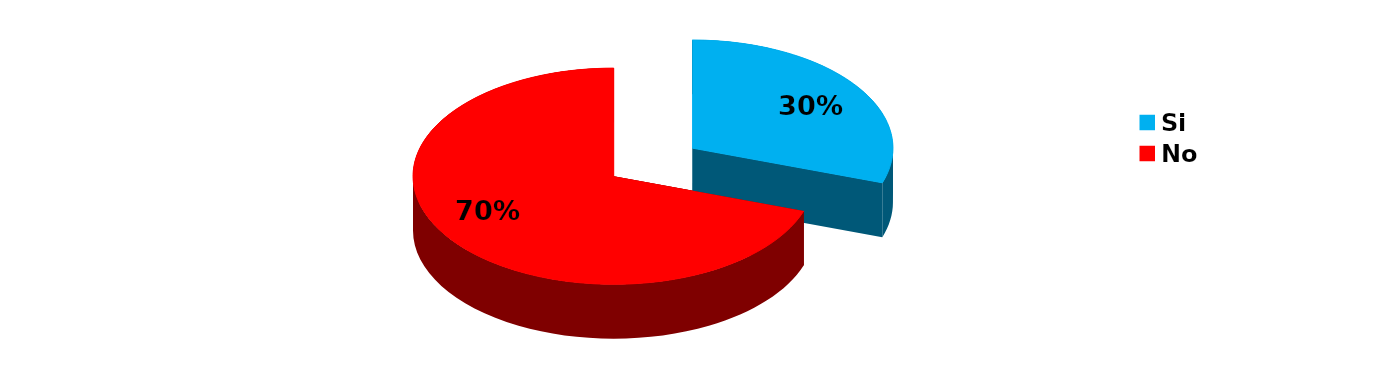
| Category | Series 0 |
|---|---|
| Si | 45 |
| No | 104 |